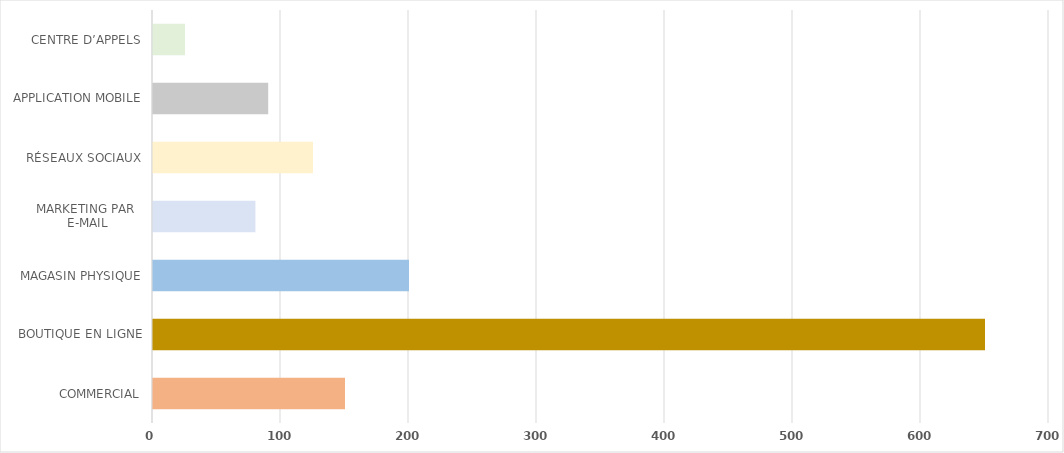
| Category | Series 0 |
|---|---|
| COMMERCIAL | 150 |
| BOUTIQUE EN LIGNE | 650 |
| MAGASIN PHYSIQUE | 200 |
| MARKETING PAR 
E-MAIL | 80 |
| RÉSEAUX SOCIAUX | 125 |
| APPLICATION MOBILE | 90 |
| CENTRE D’APPELS | 25 |